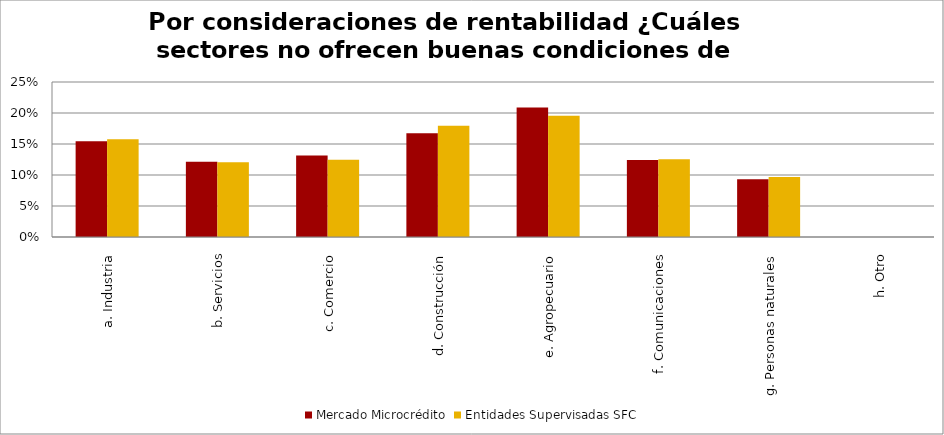
| Category | Mercado Microcrédito | Entidades Supervisadas SFC |
|---|---|---|
| a. Industria | 0.154 | 0.158 |
| b. Servicios | 0.121 | 0.121 |
| c. Comercio | 0.131 | 0.125 |
| d. Construcción | 0.167 | 0.18 |
| e. Agropecuario | 0.209 | 0.195 |
| f. Comunicaciones | 0.124 | 0.126 |
| g. Personas naturales | 0.093 | 0.097 |
| h. Otro | 0 | 0 |